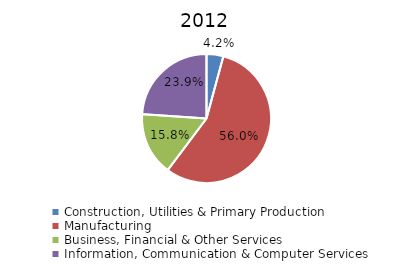
| Category | 2012 |
|---|---|
| Construction, Utilities & Primary Production  | 0.042 |
| Manufacturing  | 0.56 |
| Business, Financial & Other Services | 0.158 |
| Information, Communication & Computer Services | 0.239 |